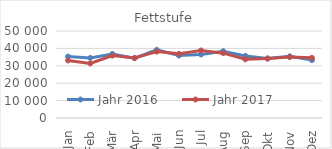
| Category | Jahr 2016 | Jahr 2017 |
|---|---|---|
| 0 | 35293.098 | 33090.182 |
| 1 | 34547.232 | 31356.591 |
| 2 | 36827.439 | 35846.579 |
| 3 | 34353.032 | 34540.612 |
| 4 | 39162.176 | 38183.545 |
| 5 | 35899.268 | 36876.392 |
| 6 | 36518.577 | 38818.294 |
| 7 | 38386.519 | 37274.165 |
| 8 | 35692.751 | 33731.252 |
| 9 | 34157.935 | 34191.016 |
| 10 | 35430.909 | 35010.48 |
| 11 | 33250.223 | 34594.517 |